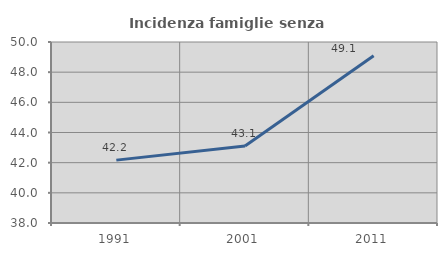
| Category | Incidenza famiglie senza nuclei |
|---|---|
| 1991.0 | 42.169 |
| 2001.0 | 43.111 |
| 2011.0 | 49.095 |